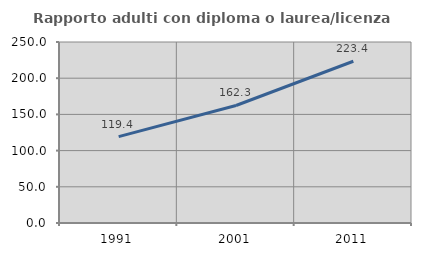
| Category | Rapporto adulti con diploma o laurea/licenza media  |
|---|---|
| 1991.0 | 119.358 |
| 2001.0 | 162.325 |
| 2011.0 | 223.447 |